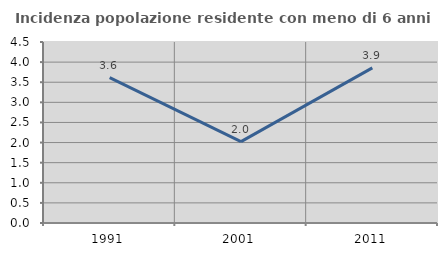
| Category | Incidenza popolazione residente con meno di 6 anni |
|---|---|
| 1991.0 | 3.613 |
| 2001.0 | 2.024 |
| 2011.0 | 3.855 |